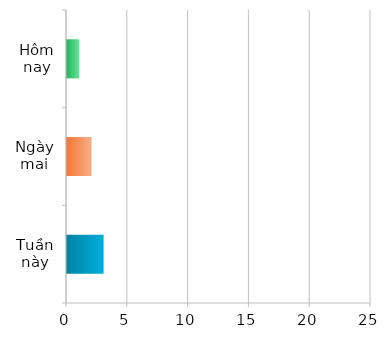
| Category | Series 0 |
|---|---|
| Tuần này | 3 |
| Ngày mai | 2 |
| Hôm nay | 1 |